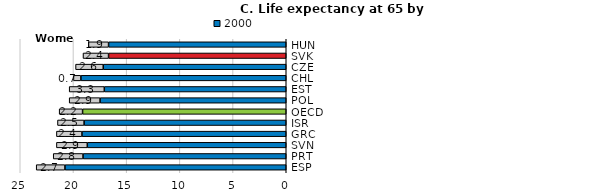
| Category | 2000 | Years gained for 2000-2014 |
|---|---|---|
| HUN | 16.7 | 1.9 |
| SVK | 16.7 | 2.4 |
| CZE | 17.2 | 2.6 |
| CHL | 19.3 | 0.7 |
| EST | 17.1 | 3.3 |
| POL | 17.5 | 2.9 |
| OECD | 19.141 | 2.2 |
| ISR | 19 | 2.5 |
| GRC | 19.2 | 2.4 |
| SVN | 18.7 | 2.9 |
| PRT | 19.1 | 2.8 |
| ESP | 20.8 | 2.7 |